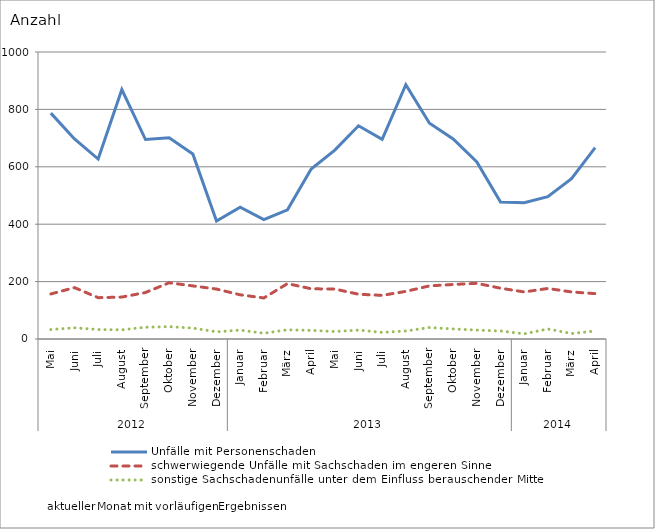
| Category | Unfälle mit Personenschaden | schwerwiegende Unfälle mit Sachschaden im engeren Sinne | sonstige Sachschadenunfälle unter dem Einfluss berauschender Mittel |
|---|---|---|---|
| 0 | 787 | 157 | 33 |
| 1 | 697 | 179 | 39 |
| 2 | 627 | 144 | 33 |
| 3 | 869 | 146 | 32 |
| 4 | 695 | 162 | 41 |
| 5 | 701 | 196 | 43 |
| 6 | 645 | 185 | 38 |
| 7 | 411 | 174 | 25 |
| 8 | 459 | 154 | 31 |
| 9 | 416 | 143 | 20 |
| 10 | 450 | 193 | 32 |
| 11 | 592 | 175 | 30 |
| 12 | 658 | 174 | 26 |
| 13 | 743 | 156 | 31 |
| 14 | 696 | 152 | 23 |
| 15 | 886 | 166 | 28 |
| 16 | 752 | 185 | 40 |
| 17 | 697 | 190 | 35 |
| 18 | 617 | 194 | 31 |
| 19 | 477 | 177 | 28 |
| 20 | 475 | 164 | 18 |
| 21 | 496 | 176 | 35 |
| 22 | 559 | 164 | 19 |
| 23 | 667 | 158 | 28 |